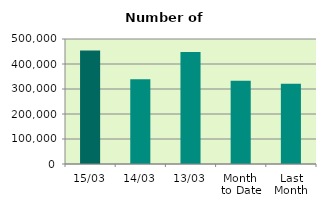
| Category | Series 0 |
|---|---|
| 15/03 | 454328 |
| 14/03 | 339044 |
| 13/03 | 448302 |
| Month 
to Date | 333131.455 |
| Last
Month | 321374.6 |